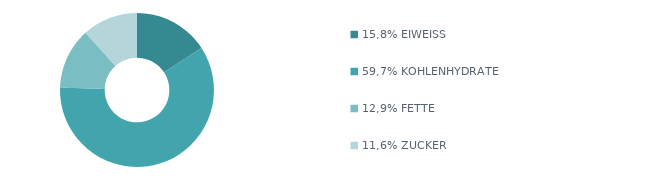
| Category | Series 0 |
|---|---|
| 15,8% EIWEISS | 915 |
| 59,7% KOHLENHYDRATE | 3460 |
| 12,9% FETTE | 745 |
| 11,6% ZUCKER | 675 |